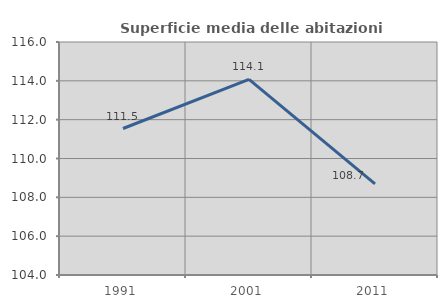
| Category | Superficie media delle abitazioni occupate |
|---|---|
| 1991.0 | 111.544 |
| 2001.0 | 114.08 |
| 2011.0 | 108.691 |